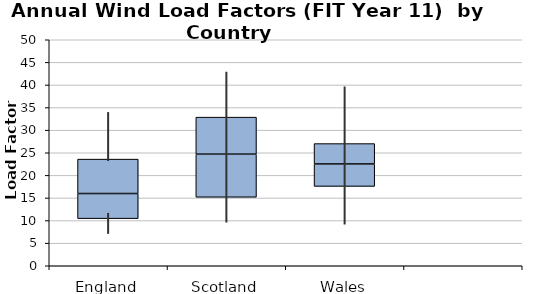
| Category | Series 0 | Series 1 | Series 2 |
|---|---|---|---|
| 0 | 10.421 | 5.557 | 7.616 |
| 1 | 15.155 | 9.536 | 8.188 |
| 2 | 17.557 | 4.965 | 4.508 |